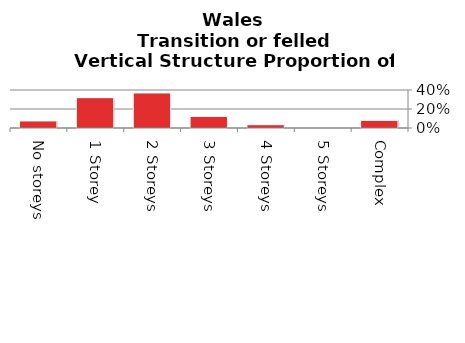
| Category | Transition or felled |
|---|---|
| No storeys | 0.074 |
| 1 Storey | 0.319 |
| 2 Storeys | 0.369 |
| 3 Storeys | 0.122 |
| 4 Storeys | 0.035 |
| 5 Storeys | 0 |
| Complex | 0.081 |